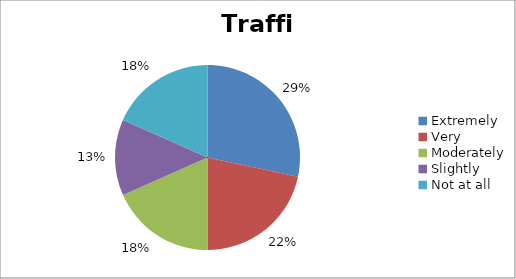
| Category | Traffic |
|---|---|
| Extremely | 17 |
| Very | 13 |
| Moderately | 11 |
| Slightly | 8 |
| Not at all | 11 |